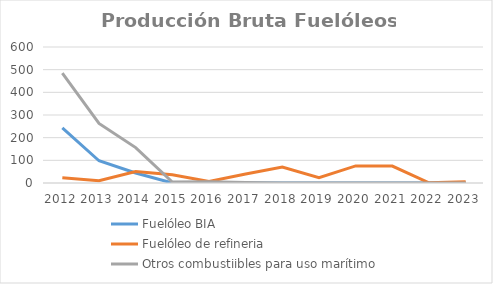
| Category | Fuelóleo BIA | Fuelóleo de refineria | Otros combustiibles para uso marítimo |
|---|---|---|---|
| 2012.0 | 242.679 | 23.423 | 484.964 |
| 2013.0 | 97.96 | 10.284 | 262.623 |
| 2014.0 | 43.962 | 50.414 | 156.216 |
| 2015.0 | 0 | 36.086 | 4.441 |
| 2016.0 | 0.011 | 6.875 | 5.198 |
| 2017.0 | 0.021 | 39.305 | 1.805 |
| 2018.0 | 0.019 | 70.665 | 0 |
| 2019.0 | 0.037 | 23.421 | 0 |
| 2020.0 | 0 | 75.244 | 0 |
| 2021.0 | 0.015 | 74.864 | 0 |
| 2022.0 | 0 | 0.972 | 0.007 |
| 2023.0 | 0.001 | 5.066 | 0.003 |